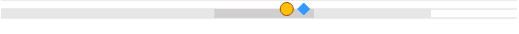
| Category | left | mid start | mid end | right |
|---|---|---|---|---|
| 0 | 0 | 0.496 | 0.232 | 0.272 |